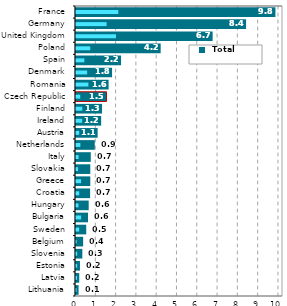
| Category |  Total |
|---|---|
| Lithuania | 0.127 |
| Latvia | 0.159 |
| Estonia | 0.195 |
| Slovenia | 0.312 |
| Belgium | 0.352 |
| Sweden | 0.504 |
| Bulgaria | 0.592 |
| Hungary | 0.625 |
| Croatia | 0.696 |
| Greece | 0.704 |
| Slovakia | 0.704 |
| Italy | 0.728 |
| Netherlands | 0.925 |
| Austria | 1.067 |
| Ireland | 1.24 |
| Finland | 1.284 |
| Czech Republic | 1.502 |
| Romania | 1.606 |
| Denmark | 1.777 |
| Spain | 2.22 |
| Poland | 4.172 |
| United Kingdom | 6.733 |
| Germany | 8.38 |
| France | 9.827 |